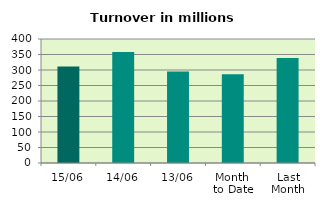
| Category | Series 0 |
|---|---|
| 15/06 | 311.366 |
| 14/06 | 358.233 |
| 13/06 | 294.995 |
| Month 
to Date | 285.923 |
| Last
Month | 338.969 |